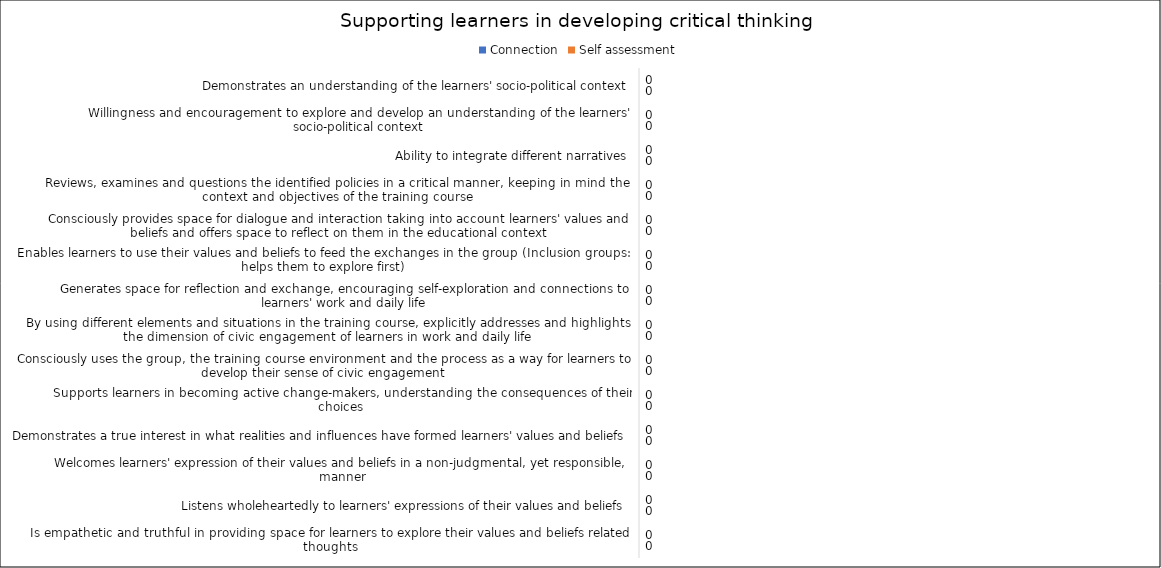
| Category | Connection | Self assessment |
|---|---|---|
| Demonstrates an understanding of the learners' socio-political context | 0 | 0 |
| Willingness and encouragement to explore and develop an understanding of the learners' socio-political context | 0 | 0 |
| Ability to integrate different narratives | 0 | 0 |
| Reviews, examines and questions the identified policies in a critical manner, keeping in mind the context and objectives of the training course | 0 | 0 |
| Consciously provides space for dialogue and interaction taking into account learners' values and beliefs and offers space to reflect on them in the educational context | 0 | 0 |
| Enables learners to use their values and beliefs to feed the exchanges in the group (Inclusion groups: helps them to explore first) | 0 | 0 |
| Generates space for reflection and exchange, encouraging self-exploration and connections to learners' work and daily life | 0 | 0 |
| By using different elements and situations in the training course, explicitly addresses and highlights the dimension of civic engagement of learners in work and daily life | 0 | 0 |
| Consciously uses the group, the training course environment and the process as a way for learners to develop their sense of civic engagement | 0 | 0 |
| Supports learners in becoming active change-makers, understanding the consequences of their choices | 0 | 0 |
| Demonstrates a true interest in what realities and influences have formed learners' values and beliefs | 0 | 0 |
| Welcomes learners' expression of their values and beliefs in a non-judgmental, yet responsible, manner | 0 | 0 |
| Listens wholeheartedly to learners' expressions of their values and beliefs | 0 | 0 |
| Is empathetic and truthful in providing space for learners to explore their values and beliefs related thoughts | 0 | 0 |